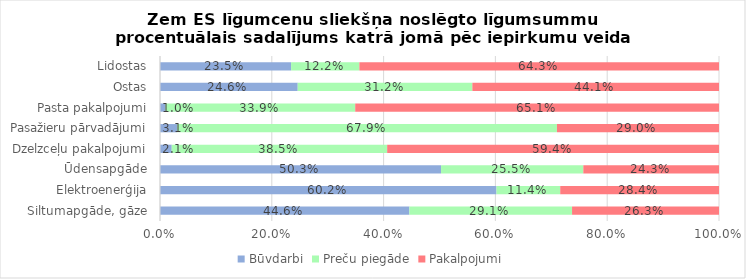
| Category | Būvdarbi | Series 2 | Preču piegāde | Series 4 | Pakalpojumi |
|---|---|---|---|---|---|
| Siltumapgāde, gāze | 0.446 |  | 0.291 |  | 0.263 |
| Elektroenerģija | 0.602 |  | 0.114 |  | 0.284 |
| Ūdensapgāde | 0.503 |  | 0.255 |  | 0.243 |
| Dzelzceļu pakalpojumi | 0.021 |  | 0.385 |  | 0.594 |
| Pasažieru pārvadājumi | 0.031 |  | 0.679 |  | 0.29 |
| Pasta pakalpojumi | 0.01 |  | 0.339 |  | 0.651 |
| Ostas | 0.246 |  | 0.312 |  | 0.441 |
| Lidostas | 0.235 |  | 0.122 |  | 0.643 |